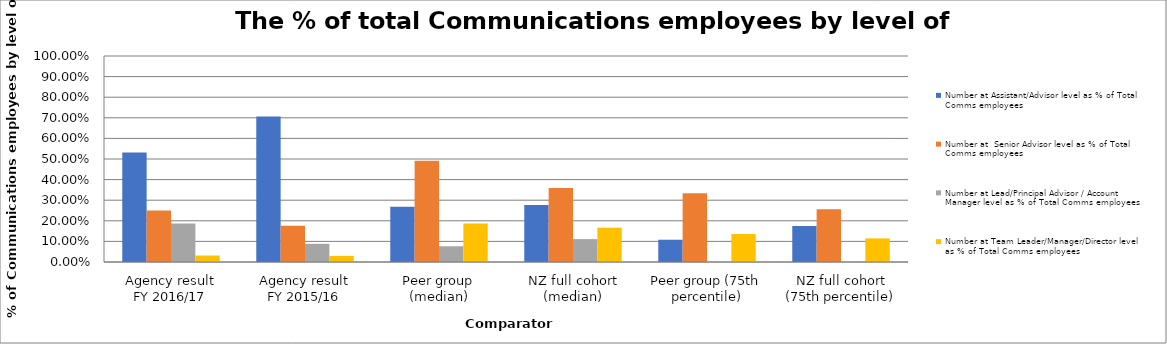
| Category | Number at Assistant/Advisor level as % of Total Comms employees | Number at  Senior Advisor level as % of Total Comms employees | Number at Lead/Principal Advisor / Account Manager level as % of Total Comms employees | Number at Team Leader/Manager/Director level as % of Total Comms employees |
|---|---|---|---|---|
| Agency result
FY 2016/17 | 0.531 | 0.25 | 0.188 | 0.031 |
| Agency result
FY 2015/16 | 0.706 | 0.176 | 0.088 | 0.029 |
| Peer group (median) | 0.268 | 0.492 | 0.076 | 0.188 |
| NZ full cohort (median) | 0.276 | 0.359 | 0.111 | 0.167 |
| Peer group (75th percentile) | 0.108 | 0.333 | 0 | 0.136 |
| NZ full cohort (75th percentile) | 0.175 | 0.256 | 0 | 0.115 |